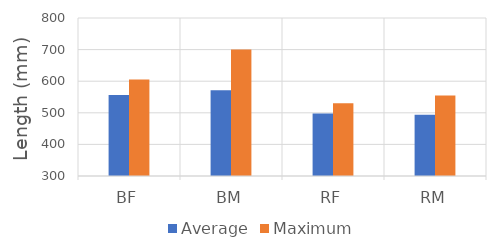
| Category | Average | Maximum |
|---|---|---|
| BF | 556 | 605 |
| BM | 571 | 700 |
| RF | 498 | 530 |
| RM | 494 | 555 |